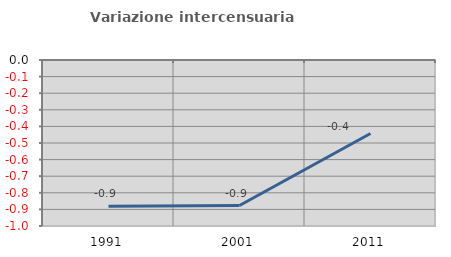
| Category | Variazione intercensuaria annua |
|---|---|
| 1991.0 | -0.881 |
| 2001.0 | -0.877 |
| 2011.0 | -0.443 |